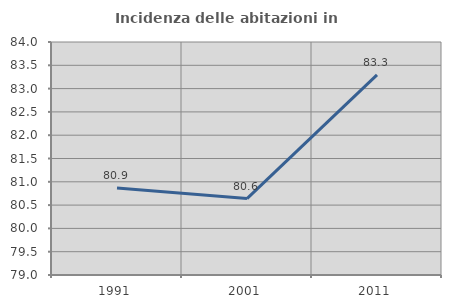
| Category | Incidenza delle abitazioni in proprietà  |
|---|---|
| 1991.0 | 80.868 |
| 2001.0 | 80.64 |
| 2011.0 | 83.295 |